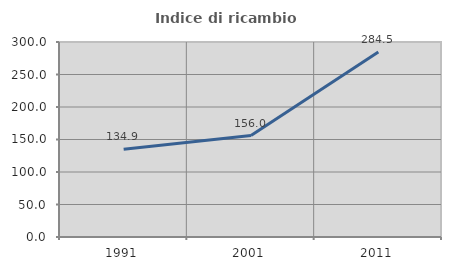
| Category | Indice di ricambio occupazionale  |
|---|---|
| 1991.0 | 134.938 |
| 2001.0 | 155.986 |
| 2011.0 | 284.534 |